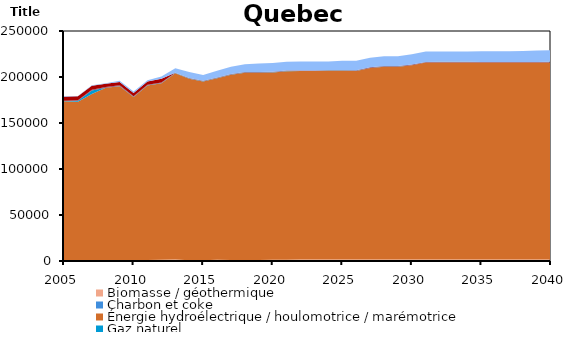
| Category | Biomasse / géothermique | Charbon et coke | Énergie hydroélectrique / houlomotrice / marémotrice | Gaz naturel | Pétrole | Solaire | Uranium | Éolien |
|---|---|---|---|---|---|---|---|---|
| 2005.0 | 646 | 0 | 173112.6 | 269 | 215.133 | 0 | 4321.577 | 416 |
| 2006.0 | 646 | 0 | 172347.6 | 1326 | 400.9 | 0 | 4321.577 | 419 |
| 2007.0 | 646 | 0 | 180856.6 | 3945 | 703.7 | 0 | 4321.577 | 617 |
| 2008.0 | 439 | 0 | 187783.8 | 228 | 554.3 | 0 | 3624.231 | 565 |
| 2009.0 | 550 | 0 | 189423 | 264 | 778.7 | 0 | 3596.279 | 1322 |
| 2010.0 | 843.915 | 0 | 177402.2 | 222.4 | 587.685 | 0 | 3551.588 | 1535.143 |
| 2011.0 | 1088.819 | 0 | 189675.6 | 174.241 | 546.181 | 0 | 3525.216 | 1393.797 |
| 2012.0 | 1232.854 | 0 | 191955.4 | 185.006 | 518.646 | 0 | 4212.618 | 2557.792 |
| 2013.0 | 1613.836 | 0 | 202512.3 | 112.844 | 475.064 | 0 | 0 | 4717.861 |
| 2014.0 | 943.515 | 0 | 197207.4 | 156.537 | 496.685 | 0 | 0 | 6649.311 |
| 2015.0 | 803.8 | 0 | 194366.2 | 137.865 | 548.037 | 0 | 0 | 6420.621 |
| 2016.0 | 1371.83 | 0 | 197242.9 | 166.88 | 697.963 | 0 | 0 | 7360.26 |
| 2017.0 | 1059.03 | 0 | 201382.7 | 154.329 | 567.449 | 0 | 0 | 8038.111 |
| 2018.0 | 1121.121 | 0 | 203630.5 | 153.991 | 567.448 | 0.26 | 0 | 8271.886 |
| 2019.0 | 1121.121 | 0 | 203630.5 | 153.983 | 567.448 | 0.26 | 0 | 9312.853 |
| 2020.0 | 1288.893 | 0 | 203693.3 | 153.983 | 567.448 | 17.78 | 0 | 9590.726 |
| 2021.0 | 1369.834 | 0 | 204953 | 153.983 | 567.447 | 17.78 | 0 | 9590.709 |
| 2022.0 | 1495.979 | 0 | 204953.1 | 153.983 | 567.448 | 17.78 | 0 | 9590.722 |
| 2023.0 | 1495.978 | 0 | 204952.9 | 153.983 | 567.447 | 17.78 | 0 | 9590.709 |
| 2024.0 | 1495.978 | 0 | 204953 | 153.983 | 567.447 | 35.3 | 0 | 9590.707 |
| 2025.0 | 1495.979 | 0 | 204953.1 | 153.983 | 567.448 | 35.3 | 0 | 10466.72 |
| 2026.0 | 1622.122 | 0 | 204953 | 153.983 | 567.447 | 35.3 | 0 | 10466.71 |
| 2027.0 | 1622.123 | 0 | 208139.9 | 153.983 | 567.447 | 35.3 | 0 | 10466.71 |
| 2028.0 | 1622.122 | 0 | 209604.2 | 153.983 | 567.447 | 52.82 | 0 | 10466.71 |
| 2029.0 | 1622.124 | 0 | 209604.4 | 153.983 | 567.448 | 52.82 | 0 | 10466.72 |
| 2030.0 | 1664.172 | 0 | 211068.7 | 153.983 | 567.448 | 52.82 | 0 | 11342.72 |
| 2031.0 | 1664.17 | 0 | 213997.2 | 153.983 | 567.447 | 52.82 | 0 | 11342.71 |
| 2032.0 | 1664.17 | 0 | 213997.2 | 153.991 | 567.447 | 79.1 | 0 | 11342.71 |
| 2033.0 | 1664.171 | 0 | 213997.3 | 154.009 | 567.447 | 79.1 | 0 | 11342.72 |
| 2034.0 | 1664.17 | 0 | 213997.2 | 153.996 | 567.447 | 79.1 | 0 | 11342.71 |
| 2035.0 | 1664.172 | 0 | 213997.5 | 153.996 | 417.169 | 79.1 | 0 | 11649.33 |
| 2036.0 | 1664.171 | 0 | 213997.2 | 154.009 | 417.169 | 105.38 | 0 | 11649.31 |
| 2037.0 | 1664.171 | 0 | 213997.3 | 154.009 | 417.169 | 105.38 | 0 | 11649.32 |
| 2038.0 | 1664.172 | 0 | 213997.3 | 154.022 | 417.169 | 105.38 | 0 | 11999.73 |
| 2039.0 | 1664.171 | 0 | 213997.3 | 154.022 | 417.169 | 171.08 | 0 | 12350.11 |
| 2040.0 | 1664.17 | 0 | 213997.2 | 154.031 | 417.168 | 263.06 | 0 | 12700.5 |